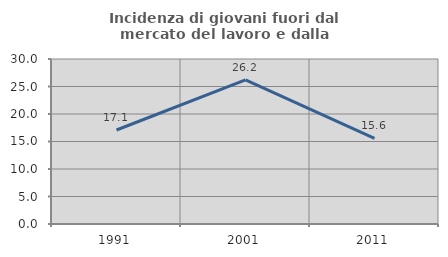
| Category | Incidenza di giovani fuori dal mercato del lavoro e dalla formazione  |
|---|---|
| 1991.0 | 17.095 |
| 2001.0 | 26.203 |
| 2011.0 | 15.578 |